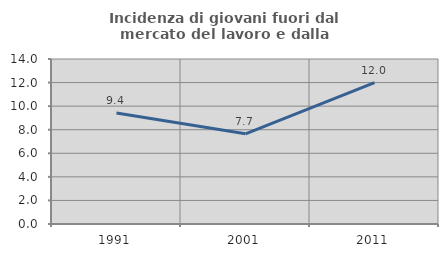
| Category | Incidenza di giovani fuori dal mercato del lavoro e dalla formazione  |
|---|---|
| 1991.0 | 9.414 |
| 2001.0 | 7.654 |
| 2011.0 | 11.993 |